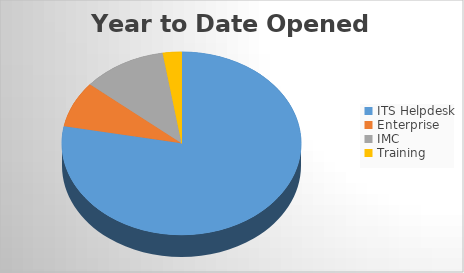
| Category | YTD Opened Tickets | 6M Opened |
|---|---|---|
| ITS Helpdesk | 1418 | 1418 |
| Enterprise | 148 | 148 |
| IMC | 206 | 206 |
| Training | 46 | 46 |